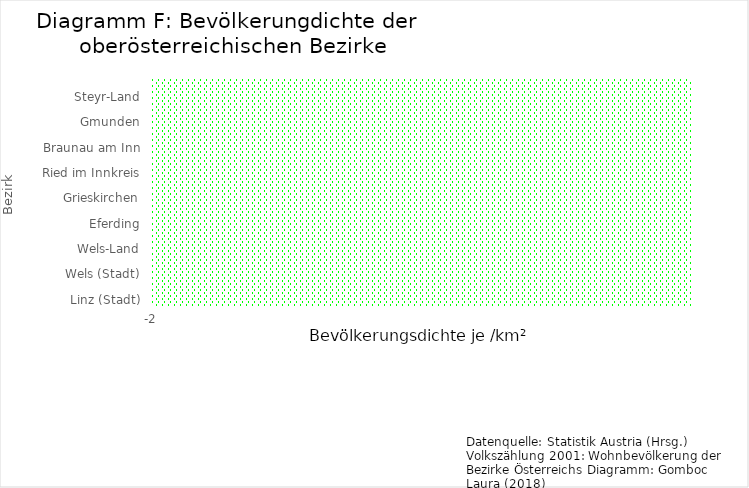
| Category | Bevölkerung pro /km² |
|---|---|
| Linz (Stadt) | 1911.898 |
| Steyr (Stadt) | 1481.175 |
| Wels (Stadt) | 1229.922 |
| Linz-Land | 280.411 |
| Wels-Land | 137.666 |
| Urfahr-Umgebung | 119.726 |
| Eferding | 118.392 |
| Vöcklabruck | 116.761 |
| Grieskirchen | 107.014 |
| Perg | 104.243 |
| Ried im Innkreis | 99.491 |
| Schärding | 92.153 |
| Braunau am Inn | 91.494 |
| Rohrbach | 69.943 |
| Gmunden | 69.352 |
| Freistadt | 64.403 |
| Steyr-Land | 59.289 |
| Kirchdorf an der Krems | 44.497 |